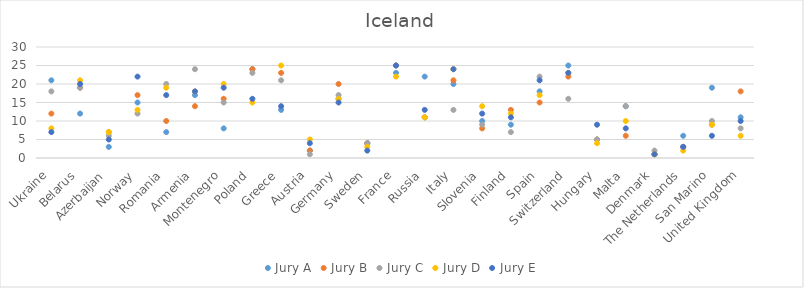
| Category | Jury A | Jury B | Jury C | Jury D | Jury E |
|---|---|---|---|---|---|
| Ukraine | 21 | 12 | 18 | 8 | 7 |
| Belarus | 12 | 19 | 19 | 21 | 20 |
| Azerbaijan | 3 | 7 | 6 | 7 | 5 |
| Norway | 15 | 17 | 12 | 13 | 22 |
| Romania | 7 | 10 | 20 | 19 | 17 |
| Armenia | 17 | 14 | 24 | 18 | 18 |
| Montenegro | 8 | 16 | 15 | 20 | 19 |
| Poland | 24 | 24 | 23 | 15 | 16 |
| Greece | 13 | 23 | 21 | 25 | 14 |
| Austria | 2 | 2 | 1 | 5 | 4 |
| Germany | 16 | 20 | 17 | 16 | 15 |
| Sweden | 4 | 4 | 4 | 3 | 2 |
| France | 23 | 25 | 25 | 22 | 25 |
| Russia | 22 | 11 | 11 | 11 | 13 |
| Italy | 20 | 21 | 13 | 24 | 24 |
| Slovenia | 10 | 8 | 9 | 14 | 12 |
| Finland | 9 | 13 | 7 | 12 | 11 |
| Spain | 18 | 15 | 22 | 17 | 21 |
| Switzerland | 25 | 22 | 16 | 23 | 23 |
| Hungary | 5 | 5 | 5 | 4 | 9 |
| Malta | 14 | 6 | 14 | 10 | 8 |
| Denmark | 1 | 1 | 2 | 1 | 1 |
| The Netherlands | 6 | 3 | 3 | 2 | 3 |
| San Marino | 19 | 9 | 10 | 9 | 6 |
| United Kingdom | 11 | 18 | 8 | 6 | 10 |